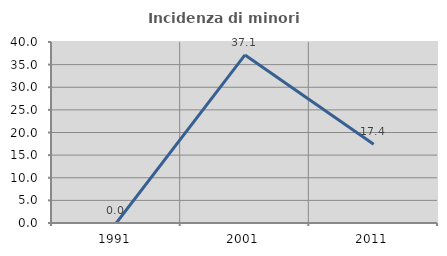
| Category | Incidenza di minori stranieri |
|---|---|
| 1991.0 | 0 |
| 2001.0 | 37.143 |
| 2011.0 | 17.391 |